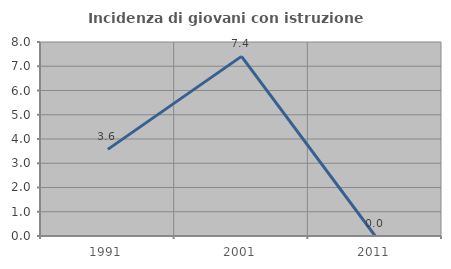
| Category | Incidenza di giovani con istruzione universitaria |
|---|---|
| 1991.0 | 3.571 |
| 2001.0 | 7.407 |
| 2011.0 | 0 |